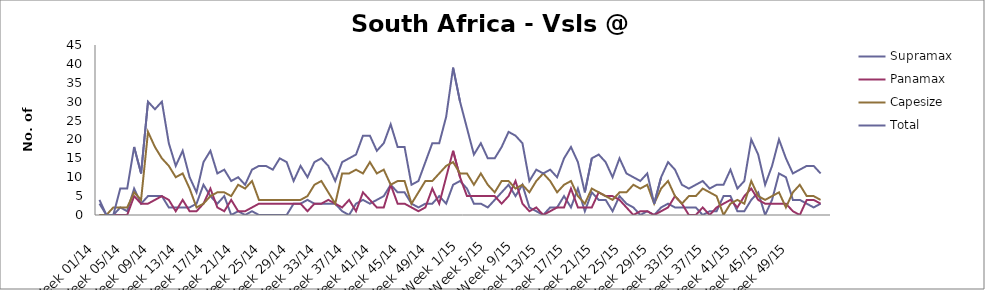
| Category | Supramax | Panamax | Capesize | Total |
|---|---|---|---|---|
| Week 01/14 | 3 | 0 | 0 | 4 |
| Week 02/14 | 0 | 0 | 0 | 0 |
| Week 03/14 | 0 | 0 | 2 | 0 |
| Week 04/14 | 2 | 0 | 2 | 7 |
| Week 05/14 | 1 | 0 | 2 | 7 |
| Week 06/14 | 7 | 5 | 6 | 18 |
| Week 07/14 | 3 | 3 | 4 | 11 |
| Week 08/14 | 5 | 3 | 22 | 30 |
| Week 09/14 | 5 | 4 | 18 | 28 |
| Week 10/14 | 5 | 5 | 15 | 30 |
| Week 11/14 | 2 | 4 | 13 | 19 |
| Week 12/14 | 2 | 1 | 10 | 13 |
| Week 13/14 | 2 | 4 | 11 | 17 |
| Week 14/14 | 2 | 1 | 7 | 10 |
| Week 15/14 | 3 | 1 | 2 | 6 |
| Week 16/14 | 8 | 3 | 3 | 14 |
| Week 17/14 | 5 | 7 | 5 | 17 |
| Week 18/14 | 3 | 2 | 6 | 11 |
| Week 19/14 | 5 | 1 | 6 | 12 |
| Week 20/14 | 0 | 4 | 5 | 9 |
| Week 21/14 | 1 | 1 | 8 | 10 |
| Week 22/14 | 0 | 1 | 7 | 8 |
| Week 23/14 | 1 | 2 | 9 | 12 |
| Week 24/14 | 0 | 3 | 4 | 13 |
| Week 25/14 | 0 | 3 | 4 | 13 |
| Week 26/14 | 0 | 3 | 4 | 12 |
| Week 27/14 | 0 | 3 | 4 | 15 |
| Week 28/14 | 0 | 3 | 4 | 14 |
| Week 29/14 | 3 | 3 | 4 | 9 |
| Week 30/14 | 3 | 3 | 4 | 13 |
| Week 31/14 | 4 | 1 | 5 | 10 |
| Week 32/14 | 3 | 3 | 8 | 14 |
| Week 33/14 | 3 | 3 | 9 | 15 |
| Week 34/14 | 3 | 4 | 6 | 13 |
| Week 35/14 | 3 | 3 | 3 | 9 |
| Week 36/14 | 1 | 2 | 11 | 14 |
| Week 37/14 | 0 | 4 | 11 | 15 |
| Week 38/14 | 3 | 1 | 12 | 16 |
| Week 39/14 | 4 | 6 | 11 | 21 |
| Week 40/14 | 3 | 4 | 14 | 21 |
| Week 41/14 | 4 | 2 | 11 | 17 |
| Week 42/14 | 5 | 2 | 12 | 19 |
| Week 43/14 | 8 | 8 | 8 | 24 |
| Week 44/14 | 6 | 3 | 9 | 18 |
| Week 45/14 | 6 | 3 | 9 | 18 |
| Week 46/14 | 3 | 2 | 3 | 8 |
| Week 47/14 | 2 | 1 | 6 | 9 |
| Week 48/14 | 3 | 2 | 9 | 14 |
| Week 49/14 | 3 | 7 | 9 | 19 |
| Week 50/14 | 5 | 3 | 11 | 19 |
| Week 51/14 | 3 | 10 | 13 | 26 |
| Week 52/14 | 8 | 17 | 14 | 39 |
| Week 1/15 | 9 | 10 | 11 | 30 |
| Week 2/15 | 7 | 5 | 11 | 23 |
| Week 3/15 | 3 | 5 | 8 | 16 |
| Week 4/15 | 3 | 5 | 11 | 19 |
| Week 5/15 | 2 | 5 | 8 | 15 |
| Week 6/15 | 4 | 5 | 6 | 15 |
| Week 7/15 | 6 | 3 | 9 | 18 |
| Week 8/15 | 8 | 5 | 9 | 22 |
| Week 9/15 | 5 | 9 | 7 | 21 |
| Week 10/15 | 8 | 3 | 8 | 19 |
| Week 11/15 | 2 | 1 | 6 | 9 |
| Week 12/15 | 1 | 2 | 9 | 12 |
| Week 13/15 | 0 | 0 | 11 | 11 |
| Week 14/15 | 2 | 1 | 9 | 12 |
| Week 15/15 | 2 | 2 | 6 | 10 |
| Week 16/15 | 5 | 2 | 8 | 15 |
| Week 17/15 | 2 | 7 | 9 | 18 |
| Week 18/15 | 7 | 2 | 5 | 14 |
| Week 19/15 | 1 | 2 | 3 | 6 |
| Week 20/15 | 6 | 2 | 7 | 15 |
| Week 21/15 | 4 | 6 | 6 | 16 |
| Week 22/15 | 4 | 5 | 5 | 14 |
| Week 23/15 | 1 | 5 | 4 | 10 |
| Week 24/15 | 5 | 4 | 6 | 15 |
| Week 25/15 | 3 | 2 | 6 | 11 |
| Week 26/15 | 2 | 0 | 8 | 10 |
| Week 27/15 | 0 | 1 | 7 | 9 |
| Week 28/15 | 1 | 1 | 8 | 11 |
| Week 29/15 | 0 | 0 | 3 | 3 |
| Week 30/15 | 2 | 1 | 7 | 10 |
| Week 31/15 | 3 | 2 | 9 | 14 |
| Week 32/15 | 2 | 5 | 5 | 12 |
| Week 33/15 | 2 | 3 | 3 | 8 |
| Week 34/15 | 2 | 0 | 5 | 7 |
| Week 35/15 | 2 | 0 | 5 | 8 |
| Week 36/15 | 0 | 2 | 7 | 9 |
| Week 37/15 | 1 | 0 | 6 | 7 |
| Week 38/15 | 1 | 2 | 5 | 8 |
| Week 39/15 | 5 | 3 | 0 | 8 |
| Week 40/15 | 5 | 4 | 3 | 12 |
| Week 41/15 | 1 | 2 | 4 | 7 |
| Week 42/15 | 1 | 5 | 3 | 9 |
| Week 43/15 | 4 | 7 | 9 | 20 |
| Week 44/15 | 6 | 4 | 5 | 16 |
| Week 45/15 | 0 | 3 | 4 | 8 |
| Week 46/15 | 4 | 3 | 5 | 13 |
| Week 47/15 | 11 | 3 | 6 | 20 |
| Week 48/15 | 10 | 3 | 2 | 15 |
| Week 49/15 | 4 | 1 | 6 | 11 |
| Week 50/15 | 4 | 0 | 8 | 12 |